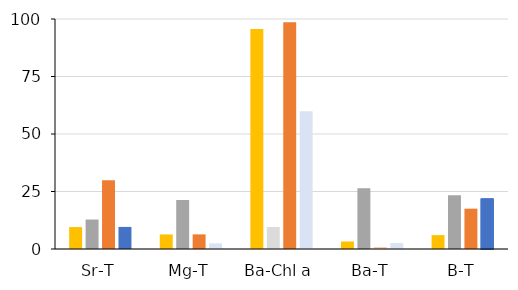
| Category | FO | IOM | ICE | GOM |
|---|---|---|---|---|
| Sr-T | 9.529 | 12.818 | 29.89 | 9.598 |
| Mg-T | 6.328 | 21.315 | 6.366 | 2.454 |
| Ba-Chl a | 95.689 | 9.578 | 98.579 | 59.934 |
| Ba-T | 3.259 | 26.419 | 0.841 | 2.552 |
| B-T | 6.032 | 23.367 | 17.531 | 21.888 |